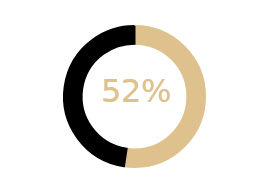
| Category | Total |
|---|---|
| First generation | 0.524 |
| Non-first generation | 0.476 |